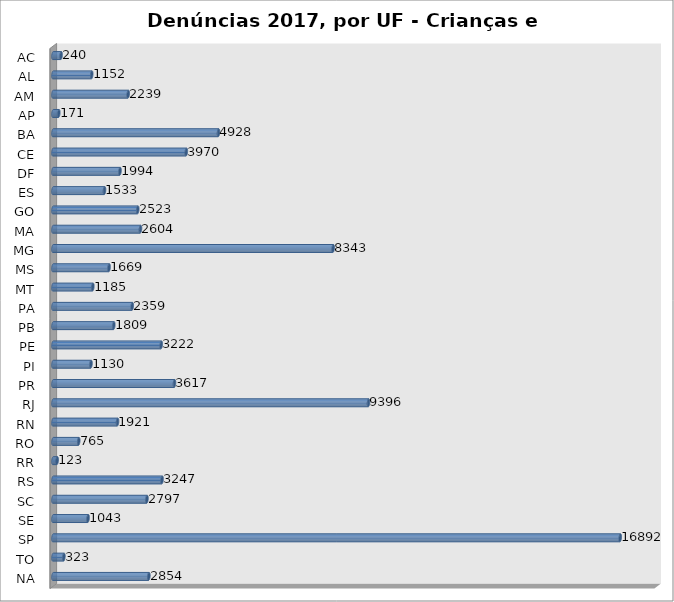
| Category | Series 0 |
|---|---|
| AC | 240 |
| AL | 1152 |
| AM | 2239 |
| AP | 171 |
| BA | 4928 |
| CE | 3970 |
| DF | 1994 |
| ES | 1533 |
| GO | 2523 |
| MA | 2604 |
| MG | 8343 |
| MS | 1669 |
| MT | 1185 |
| PA | 2359 |
| PB | 1809 |
| PE | 3222 |
| PI | 1130 |
| PR | 3617 |
| RJ | 9396 |
| RN | 1921 |
| RO | 765 |
| RR | 123 |
| RS | 3247 |
| SC | 2797 |
| SE | 1043 |
| SP | 16892 |
| TO | 323 |
| NA | 2854 |